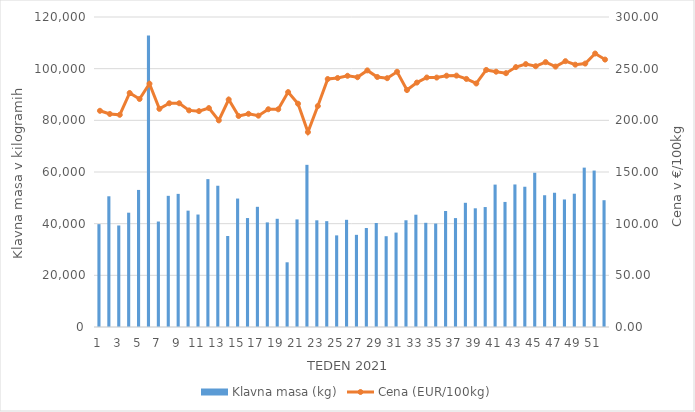
| Category | Klavna masa (kg) |
|---|---|
| 1.0 | 39814 |
| 2.0 | 50603 |
| 3.0 | 39295 |
| 4.0 | 44250 |
| 5.0 | 53061 |
| 6.0 | 112816 |
| 7.0 | 40829 |
| 8.0 | 50775 |
| 9.0 | 51535 |
| 10.0 | 45040 |
| 11.0 | 43536 |
| 12.0 | 57246 |
| 13.0 | 54680 |
| 14.0 | 35237 |
| 15.0 | 49721 |
| 16.0 | 42177 |
| 17.0 | 46525 |
| 18.0 | 40491 |
| 19.0 | 41888 |
| 20.0 | 25048 |
| 21.0 | 41651 |
| 22.0 | 62774 |
| 23.0 | 41297 |
| 24.0 | 40971 |
| 25.0 | 35465 |
| 26.0 | 41489 |
| 27.0 | 35675 |
| 28.0 | 38316 |
| 29.0 | 40265 |
| 30.0 | 35146 |
| 31.0 | 36548 |
| 32.0 | 41314 |
| 33.0 | 43471 |
| 34.0 | 40333 |
| 35.0 | 40041 |
| 36.0 | 44895 |
| 37.0 | 42158 |
| 38.0 | 48077 |
| 39.0 | 45950 |
| 40.0 | 46433 |
| 41.0 | 55121 |
| 42.0 | 48414 |
| 43.0 | 55179 |
| 44.0 | 54294 |
| 45.0 | 59707 |
| 46.0 | 51007 |
| 47.0 | 52010 |
| 48.0 | 49369 |
| 49.0 | 51594 |
| 50.0 | 61693 |
| 51.0 | 60557 |
| 52.0 | 49080 |